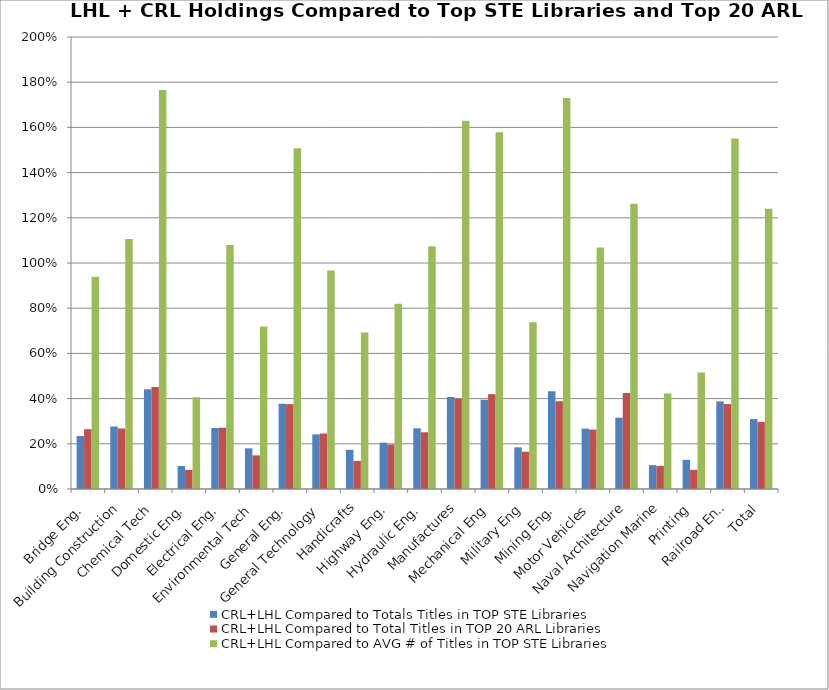
| Category | CRL+LHL Compared to Totals Titles in TOP STE Libraries | CRL+LHL Compared to Total Titles in TOP 20 ARL Libraries | CRL+LHL Compared to AVG # of Titles in TOP STE Libraries |
|---|---|---|---|
| Bridge Eng. | 0.235 | 0.265 | 0.939 |
| Building Construction | 0.277 | 0.268 | 1.106 |
| Chemical Tech | 0.441 | 0.451 | 1.766 |
| Domestic Eng. | 0.101 | 0.084 | 0.406 |
| Electrical Eng. | 0.27 | 0.271 | 1.08 |
| Environmental Tech | 0.18 | 0.149 | 0.719 |
| General Eng. | 0.377 | 0.376 | 1.507 |
| General Technology | 0.242 | 0.246 | 0.967 |
| Handicrafts | 0.173 | 0.124 | 0.693 |
| Highway Eng. | 0.205 | 0.197 | 0.82 |
| Hydraulic Eng. | 0.269 | 0.251 | 1.074 |
| Manufactures | 0.407 | 0.401 | 1.63 |
| Mechanical Eng | 0.395 | 0.42 | 1.579 |
| Military Eng | 0.184 | 0.165 | 0.737 |
| Mining Eng. | 0.432 | 0.388 | 1.73 |
| Motor Vehicles | 0.267 | 0.263 | 1.069 |
| Naval Architecture | 0.316 | 0.424 | 1.262 |
| Navigation Marine | 0.106 | 0.102 | 0.423 |
| Printing | 0.129 | 0.085 | 0.516 |
| Railroad Eng. | 0.388 | 0.376 | 1.55 |
| Total | 0.31 | 0.297 | 1.24 |